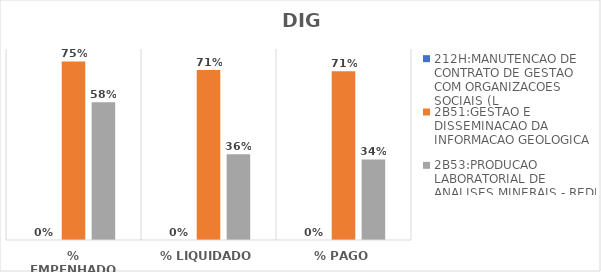
| Category | 212H:MANUTENCAO DE CONTRATO DE GESTAO COM ORGANIZACOES SOCIAIS (L | 2B51:GESTAO E DISSEMINACAO DA INFORMACAO GEOLOGICA | 2B53:PRODUCAO LABORATORIAL DE ANALISES MINERAIS - REDE LAMIN |
|---|---|---|---|
| % EMPENHADO | 0 | 0.748 | 0.577 |
| % LIQUIDADO | 0 | 0.712 | 0.36 |
| % PAGO | 0 | 0.707 | 0.338 |